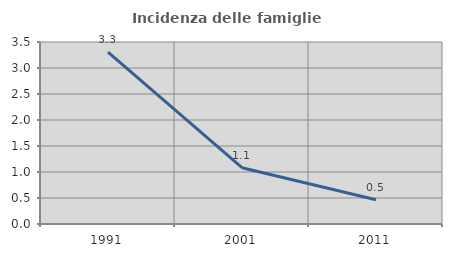
| Category | Incidenza delle famiglie numerose |
|---|---|
| 1991.0 | 3.304 |
| 2001.0 | 1.082 |
| 2011.0 | 0.465 |